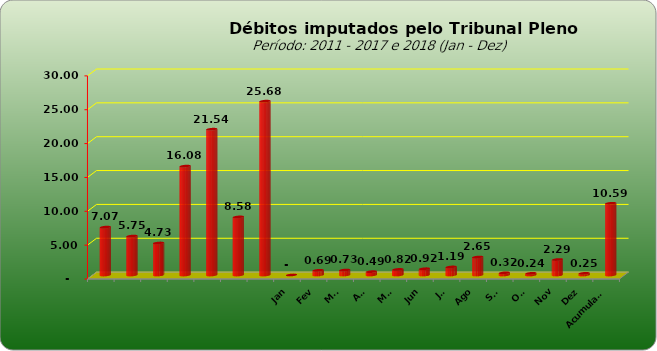
| Category |  7.073.154,74  |
|---|---|
|  | 7073154.74 |
|  | 5749129.25 |
|  | 4727033.51 |
|  | 16081820.48 |
|  | 21535723.6 |
|  | 8578266.09 |
|  | 25676499.17 |
| Jan | 0 |
| Fev | 689867.86 |
| Mar | 729624.1 |
| Abr | 491509.68 |
| Mai | 824303.32 |
| Jun | 924019.84 |
| Jul | 1188655.7 |
| Ago | 2651249.45 |
| Set | 319560.5 |
| Out | 243398.37 |
| Nov | 2285181.69 |
| Dez | 245544.67 |
| Acumulado | 10590282.73 |